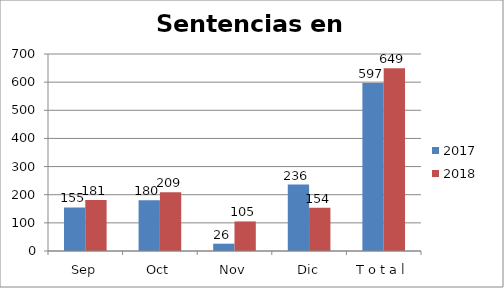
| Category | 2017 | 2018 |
|---|---|---|
| Sep | 155 | 181 |
| Oct | 180 | 209 |
| Nov | 26 | 105 |
| Dic | 236 | 154 |
| T o t a l | 597 | 649 |